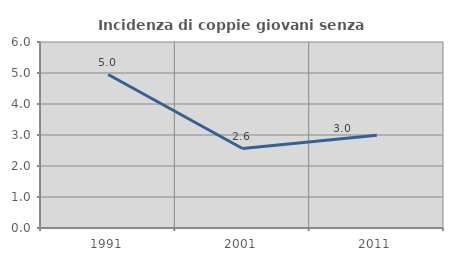
| Category | Incidenza di coppie giovani senza figli |
|---|---|
| 1991.0 | 4.95 |
| 2001.0 | 2.564 |
| 2011.0 | 2.994 |